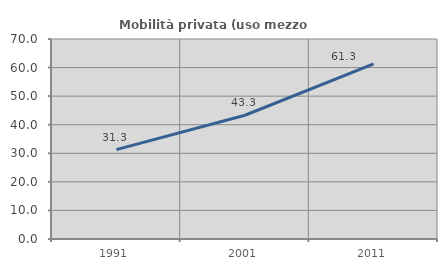
| Category | Mobilità privata (uso mezzo privato) |
|---|---|
| 1991.0 | 31.283 |
| 2001.0 | 43.314 |
| 2011.0 | 61.311 |